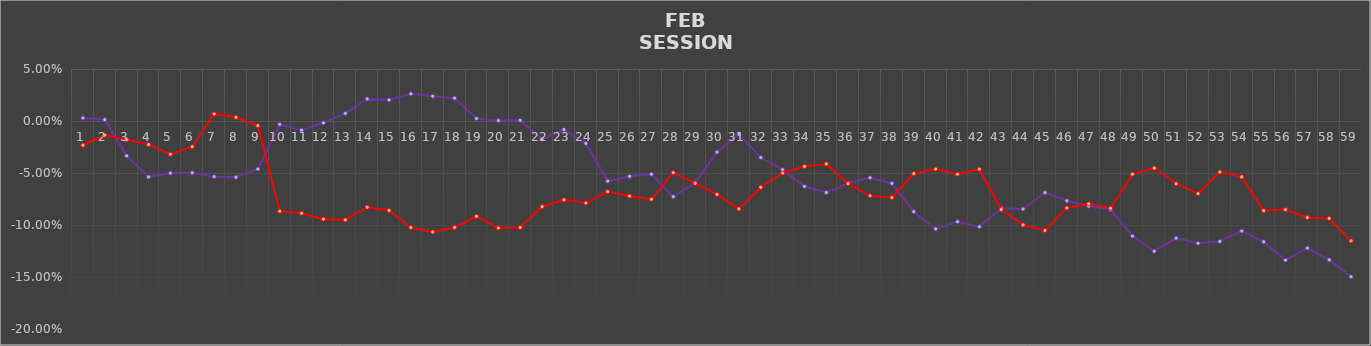
| Category | Series 0 | Series 1 |
|---|---|---|
| 0 | 0.003 | -0.023 |
| 1 | 0.001 | -0.014 |
| 2 | -0.034 | -0.018 |
| 3 | -0.054 | -0.023 |
| 4 | -0.05 | -0.032 |
| 5 | -0.05 | -0.025 |
| 6 | -0.054 | 0.007 |
| 7 | -0.054 | 0.004 |
| 8 | -0.046 | -0.004 |
| 9 | -0.003 | -0.087 |
| 10 | -0.009 | -0.089 |
| 11 | -0.002 | -0.094 |
| 12 | 0.007 | -0.095 |
| 13 | 0.021 | -0.083 |
| 14 | 0.02 | -0.086 |
| 15 | 0.026 | -0.102 |
| 16 | 0.024 | -0.107 |
| 17 | 0.022 | -0.102 |
| 18 | 0.002 | -0.092 |
| 19 | 0 | -0.103 |
| 20 | 0.001 | -0.102 |
| 21 | -0.017 | -0.082 |
| 22 | -0.008 | -0.076 |
| 23 | -0.022 | -0.079 |
| 24 | -0.058 | -0.068 |
| 25 | -0.053 | -0.072 |
| 26 | -0.051 | -0.075 |
| 27 | -0.073 | -0.05 |
| 28 | -0.059 | -0.06 |
| 29 | -0.03 | -0.071 |
| 30 | -0.013 | -0.084 |
| 31 | -0.035 | -0.064 |
| 32 | -0.047 | -0.05 |
| 33 | -0.063 | -0.044 |
| 34 | -0.069 | -0.041 |
| 35 | -0.06 | -0.06 |
| 36 | -0.055 | -0.072 |
| 37 | -0.06 | -0.074 |
| 38 | -0.087 | -0.051 |
| 39 | -0.104 | -0.046 |
| 40 | -0.097 | -0.051 |
| 41 | -0.102 | -0.046 |
| 42 | -0.084 | -0.085 |
| 43 | -0.085 | -0.1 |
| 44 | -0.069 | -0.105 |
| 45 | -0.077 | -0.084 |
| 46 | -0.082 | -0.08 |
| 47 | -0.085 | -0.084 |
| 48 | -0.111 | -0.051 |
| 49 | -0.125 | -0.045 |
| 50 | -0.113 | -0.06 |
| 51 | -0.118 | -0.07 |
| 52 | -0.116 | -0.049 |
| 53 | -0.106 | -0.054 |
| 54 | -0.116 | -0.086 |
| 55 | -0.134 | -0.085 |
| 56 | -0.122 | -0.093 |
| 57 | -0.134 | -0.094 |
| 58 | -0.15 | -0.115 |